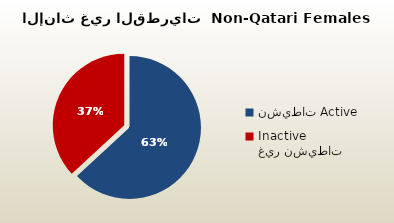
| Category | الاناث غير القطريات  Non-Qatari Females |
|---|---|
| نشيطات Active | 236260 |
| غير نشيطات Inactive | 138024 |